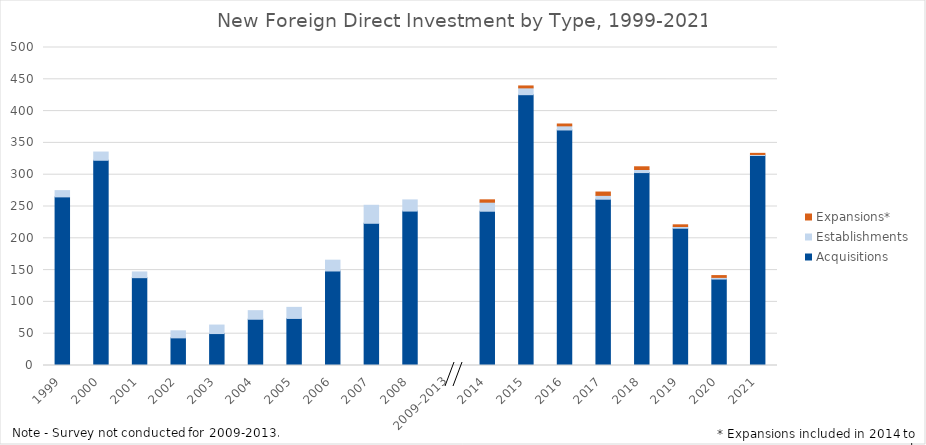
| Category | Acquisitions | Establishments | Expansions* |
|---|---|---|---|
| 1999 | 265.127 | 9.829 | 0 |
| 2000 | 322.703 | 12.926 | 0 |
| 2001 | 138.091 | 9.017 | 0 |
| 2002 | 43.442 | 11.077 | 0 |
| 2003 | 50.212 | 13.379 | 0 |
| 2004 | 72.738 | 13.481 | 0 |
| 2005 | 73.997 | 17.393 | 0 |
| 2006 | 148.604 | 16.999 | 0 |
| 2007 | 223.616 | 28.301 | 0 |
| 2008 | 242.799 | 17.564 | 0 |
| 2009–2013 | 0 | 0 | 0 |
| 2014 | 242.58 | 14.183 | 3.724 |
| 2015 | 425.788 | 10.739 | 3.037 |
| 2016 | 370.317 | 6.504 | 2.907 |
| 2017 | 261.455 | 6.044 | 5.257 |
| 2018 | 303.334 | 4.88 | 4.241 |
| 2019 | 215.847 | 2.728 | 2.64 |
| 2020 | 135.919 | 2.623 | 2.829 |
| 2021 | 330.165 | 1.64 | 1.761 |